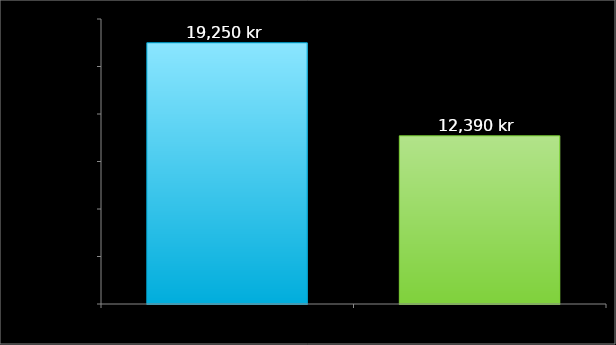
| Category | Series 0 |
|---|---|
| 0 | 19250 |
| 1 | 12390 |